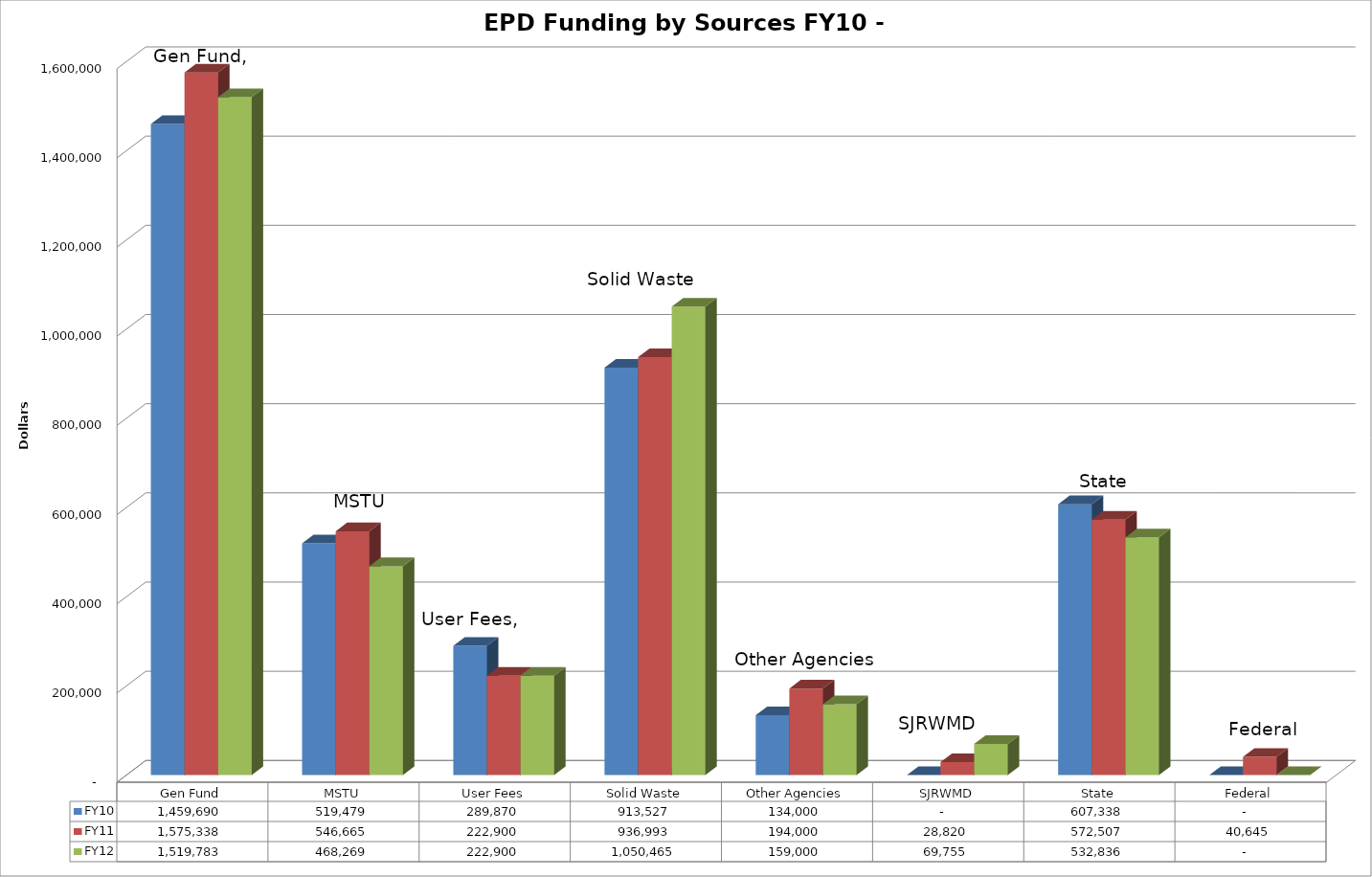
| Category | FY10 | FY11 | FY12 |
|---|---|---|---|
| Gen Fund | 1459690 | 1575338 | 1519783 |
| MSTU | 519479 | 546665 | 468269 |
| User Fees | 289870 | 222900 | 222900 |
| Solid Waste | 913527 | 936993 | 1050465 |
| Other Agencies | 134000 | 194000 | 159000 |
| SJRWMD | 0 | 28820 | 69755 |
| State | 607338 | 572507 | 532836 |
| Federal | 0 | 40645 | 0 |